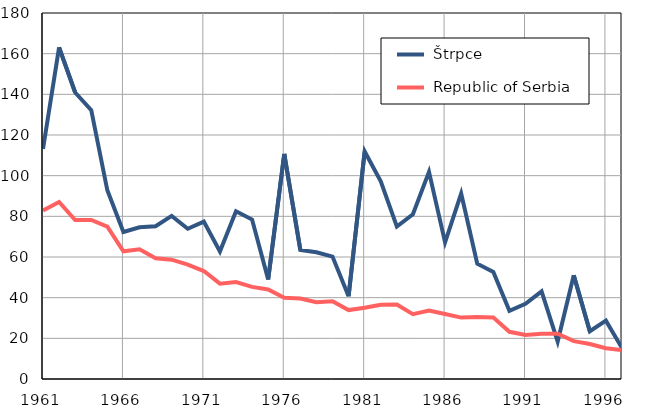
| Category |  Štrpce |  Republic of Serbia |
|---|---|---|
| 1961.0 | 113.1 | 82.9 |
| 1962.0 | 163.1 | 87.1 |
| 1963.0 | 140.9 | 78.2 |
| 1964.0 | 132.2 | 78.2 |
| 1965.0 | 92.8 | 74.9 |
| 1966.0 | 72.3 | 62.8 |
| 1967.0 | 74.6 | 63.8 |
| 1968.0 | 75.1 | 59.4 |
| 1969.0 | 80.2 | 58.7 |
| 1970.0 | 73.9 | 56.3 |
| 1971.0 | 77.4 | 53.1 |
| 1972.0 | 62.7 | 46.9 |
| 1973.0 | 82.5 | 47.7 |
| 1974.0 | 78.4 | 45.3 |
| 1975.0 | 48.9 | 44 |
| 1976.0 | 110.7 | 39.9 |
| 1977.0 | 63.5 | 39.6 |
| 1978.0 | 62.3 | 37.8 |
| 1979.0 | 60.2 | 38.2 |
| 1980.0 | 40.7 | 33.9 |
| 1981.0 | 111.9 | 35 |
| 1982.0 | 97.2 | 36.5 |
| 1983.0 | 75 | 36.6 |
| 1984.0 | 81 | 31.9 |
| 1985.0 | 101.9 | 33.7 |
| 1986.0 | 67.2 | 32 |
| 1987.0 | 91.2 | 30.2 |
| 1988.0 | 56.7 | 30.5 |
| 1989.0 | 52.6 | 30.2 |
| 1990.0 | 33.5 | 23.2 |
| 1991.0 | 37 | 21.6 |
| 1992.0 | 43.1 | 22.3 |
| 1993.0 | 18.4 | 22.3 |
| 1994.0 | 51 | 18.6 |
| 1995.0 | 23.5 | 17.2 |
| 1996.0 | 28.7 | 15.1 |
| 1997.0 | 15.2 | 14.2 |